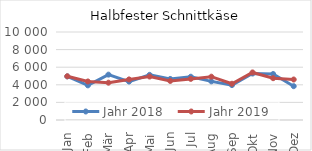
| Category | Jahr 2018 | Jahr 2019 |
|---|---|---|
| Jan | 4956.669 | 4967.849 |
| Feb | 3936.862 | 4377.904 |
| Mär | 5154.383 | 4239.089 |
| Apr | 4367.448 | 4611.937 |
| Mai | 5131.292 | 4937.934 |
| Jun | 4663.896 | 4438.641 |
| Jul | 4917.473 | 4671.223 |
| Aug | 4391.483 | 4922.342 |
| Sep | 3966.441 | 4119.064 |
| Okt | 5280.243 | 5404.873 |
| Nov | 5226.308 | 4751.718 |
| Dez | 3842.667 | 4602.229 |